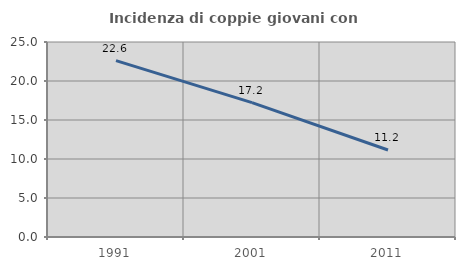
| Category | Incidenza di coppie giovani con figli |
|---|---|
| 1991.0 | 22.617 |
| 2001.0 | 17.228 |
| 2011.0 | 11.157 |